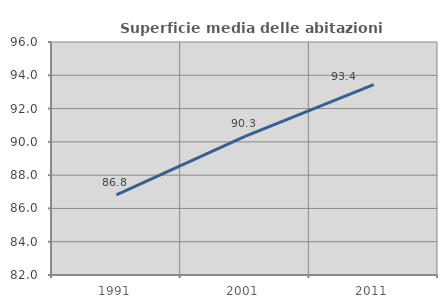
| Category | Superficie media delle abitazioni occupate |
|---|---|
| 1991.0 | 86.821 |
| 2001.0 | 90.323 |
| 2011.0 | 93.439 |